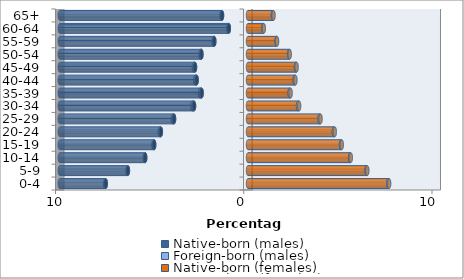
| Category | Native-born (males) | Foreign-born (males) | Native-born (females) | Foreign-born (females) |
|---|---|---|---|---|
| 0-4 | -7.558 | -0.038 | 7.45 | 0.049 |
| 5-9 | -6.38 | -0.027 | 6.299 | 0.039 |
| 10-14 | -5.461 | -0.029 | 5.422 | 0.039 |
| 15-19 | -4.984 | -0.04 | 4.938 | 0.045 |
| 20-24 | -4.628 | -0.059 | 4.558 | 0.053 |
| 25-29 | -3.928 | -0.076 | 3.796 | 0.059 |
| 30-34 | -2.866 | -0.09 | 2.658 | 0.06 |
| 35-39 | -2.462 | -0.09 | 2.211 | 0.055 |
| 40-44 | -2.727 | -0.081 | 2.472 | 0.048 |
| 45-49 | -2.815 | -0.064 | 2.545 | 0.039 |
| 50-54 | -2.474 | -0.048 | 2.185 | 0.031 |
| 55-59 | -1.79 | -0.036 | 1.519 | 0.025 |
| 60-64 | -1.019 | -0.026 | 0.816 | 0.021 |
| 65+ | -1.38 | -0.033 | 1.319 | 0.038 |